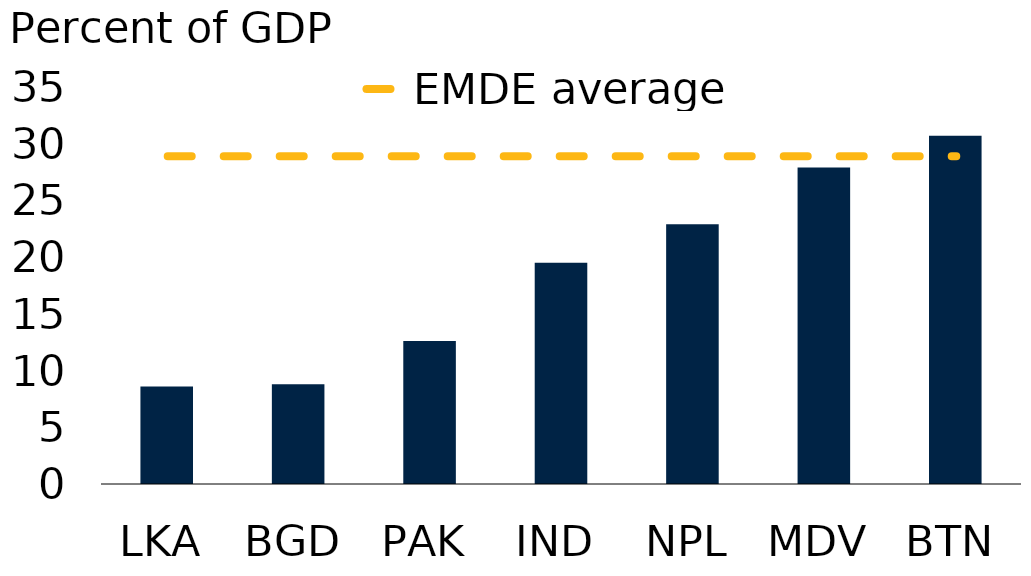
| Category | Series 0 |
|---|---|
| LKA | 8.6 |
| BGD | 8.8 |
| PAK | 12.6 |
| IND | 19.5 |
| NPL | 22.9 |
| MDV | 27.9 |
| BTN | 30.7 |